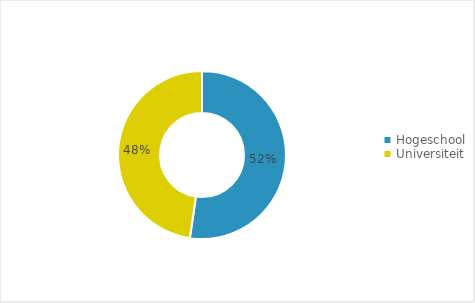
| Category | Series 1 |
|---|---|
| Hogeschool | 0.523 |
| Universiteit | 0.477 |